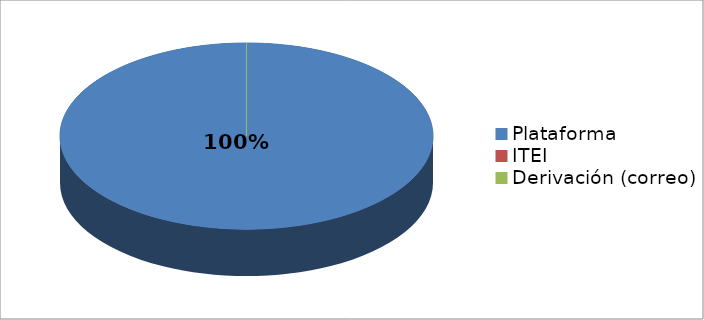
| Category | Series 0 | Series 1 |
|---|---|---|
| Plataforma | 5 | 1 |
| ITEI | 0 | 0 |
| Derivación (correo) | 0 | 1 |